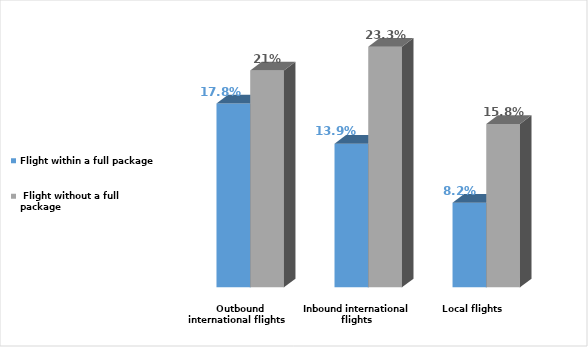
| Category | Flight within a full package |  Flight without a full package  |
|---|---|---|
| Local flights  | 0.082 | 0.158 |
| Inbound international flights  | 0.139 | 0.233 |
| Outbound international flights  | 0.178 | 0.21 |